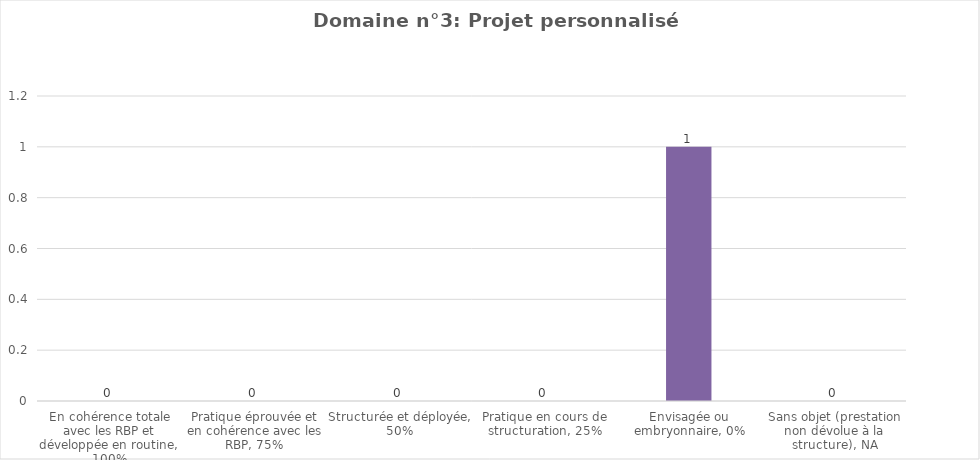
| Category | Domaine n°3: Projet personnalisé d'interventions (PPI) |
|---|---|
| En cohérence totale avec les RBP et développée en routine, 100% | 0 |
| Pratique éprouvée et en cohérence avec les RBP, 75% | 0 |
| Structurée et déployée, 50% | 0 |
| Pratique en cours de structuration, 25% | 0 |
| Envisagée ou embryonnaire, 0% | 1 |
| Sans objet (prestation non dévolue à la structure), NA | 0 |